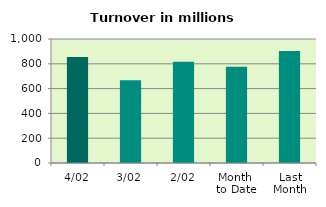
| Category | Series 0 |
|---|---|
| 4/02 | 855.228 |
| 3/02 | 666.777 |
| 2/02 | 817.493 |
| Month 
to Date | 776.879 |
| Last
Month | 902.557 |